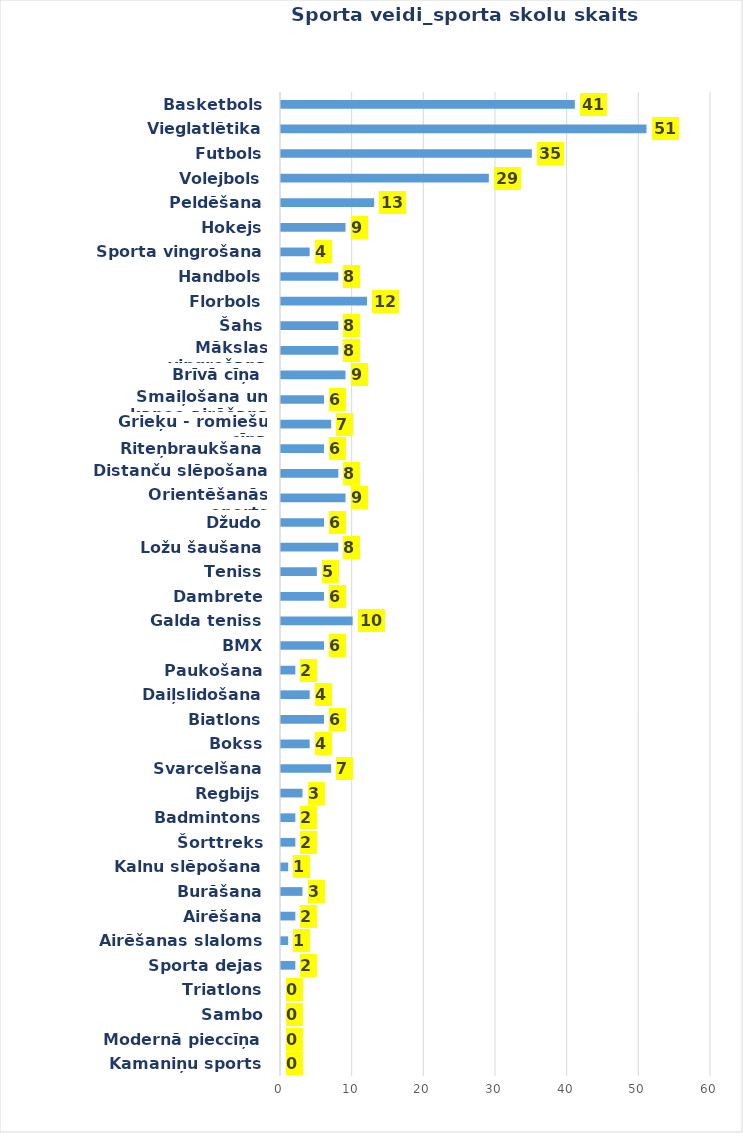
| Category | Sporta skolu
 skaits |
|---|---|
| Kamaniņu sports | 0 |
| Modernā pieccīņa | 0 |
| Sambo | 0 |
| Triatlons | 0 |
| Sporta dejas | 2 |
| Airēšanas slaloms | 1 |
| Airēšana | 2 |
| Burāšana | 3 |
| Kalnu slēpošana | 1 |
| Šorttreks | 2 |
| Badmintons | 2 |
| Regbijs | 3 |
| Svarcelšana | 7 |
| Bokss | 4 |
| Biatlons | 6 |
| Daiļslidošana | 4 |
| Paukošana | 2 |
| BMX | 6 |
| Galda teniss | 10 |
| Dambrete | 6 |
| Teniss | 5 |
| Ložu šaušana | 8 |
| Džudo | 6 |
| Orientēšanās sports | 9 |
| Distanču slēpošana | 8 |
| Riteņbraukšana | 6 |
| Grieķu - romiešu cīņa | 7 |
| Smaiļošana un kanoe airēšana | 6 |
| Brīvā cīņa | 9 |
| Mākslas vingrošana | 8 |
| Šahs | 8 |
| Florbols | 12 |
| Handbols | 8 |
| Sporta vingrošana | 4 |
| Hokejs | 9 |
| Peldēšana | 13 |
| Volejbols | 29 |
| Futbols | 35 |
| Vieglatlētika | 51 |
| Basketbols | 41 |